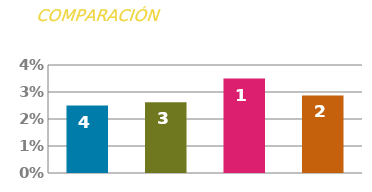
| Category | TASA |
|---|---|
| 0 | 0.025 |
| 1 | 0.026 |
| 2 | 0.035 |
| 3 | 0.029 |